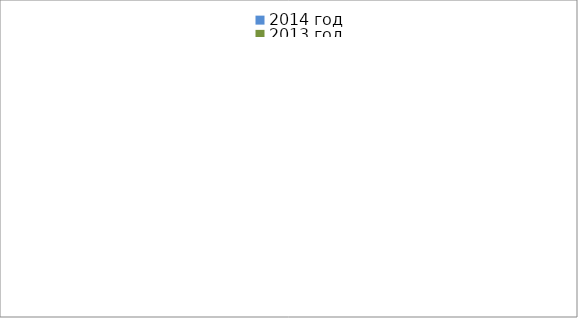
| Category | 2014 год | 2013 год |
|---|---|---|
|  - поджог | 8 | 20 |
|  - неосторожное обращение с огнём | 18 | 20 |
|  - НПТЭ электрооборудования | 11 | 17 |
|  - НПУ и Э печей | 42 | 33 |
|  - НПУ и Э транспортных средств | 37 | 42 |
|   -Шалость с огнем детей | 0 | 3 |
|  -НППБ при эксплуатации эл.приборов | 12 | 16 |
|  - курение | 10 | 8 |
| - прочие | 50 | 38 |
| - не установленные причины | 9 | 1 |